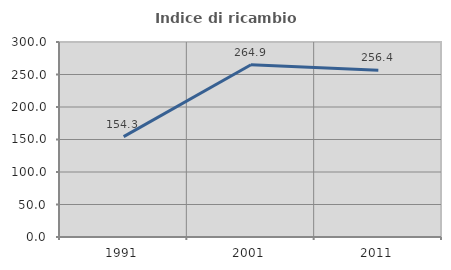
| Category | Indice di ricambio occupazionale  |
|---|---|
| 1991.0 | 154.348 |
| 2001.0 | 264.948 |
| 2011.0 | 256.364 |